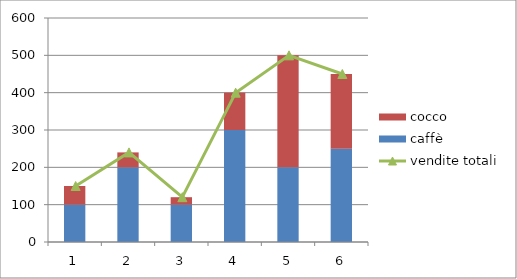
| Category | caffè | cocco |
|---|---|---|
| 0 | 100 | 50 |
| 1 | 200 | 40 |
| 2 | 100 | 20 |
| 3 | 300 | 100 |
| 4 | 200 | 300 |
| 5 | 250 | 200 |